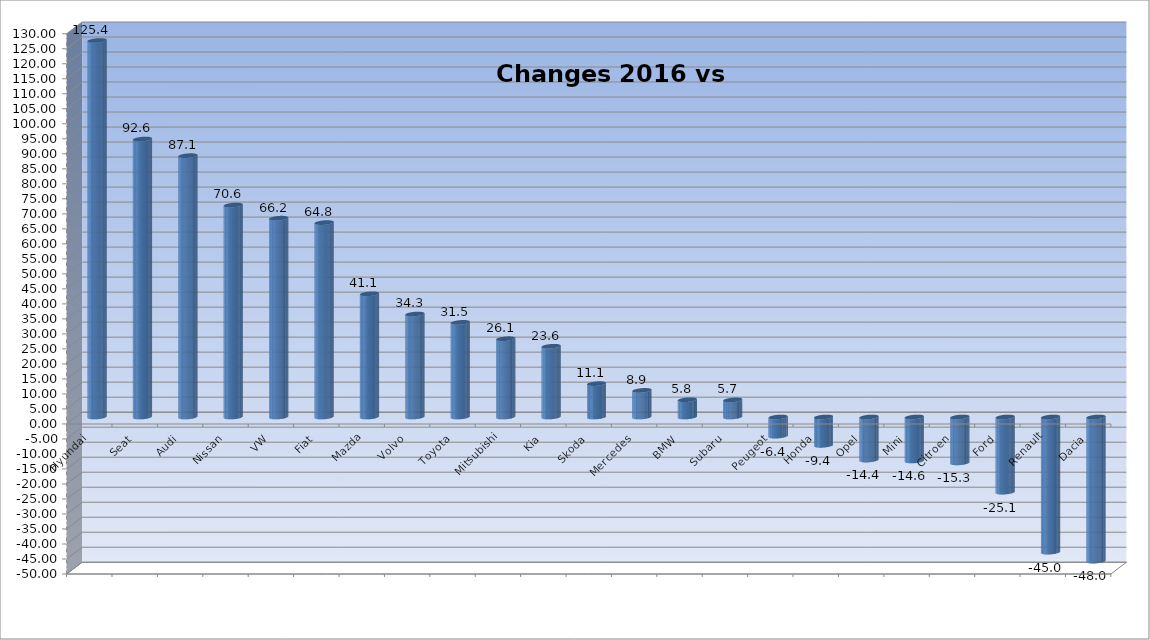
| Category | Ytd 2015 |
|---|---|
| Hyundai | 125.436 |
| Seat | 92.612 |
| Audi | 87.072 |
| Nissan | 70.614 |
| VW | 66.24 |
| Fiat | 64.773 |
| Mazda | 41.05 |
| Volvo | 34.303 |
| Toyota | 31.523 |
| Mitsubishi | 26.087 |
| Kia | 23.576 |
| Skoda | 11.111 |
| Mercedes | 8.863 |
| BMW | 5.751 |
| Subaru | 5.691 |
| Peugeot | -6.386 |
| Honda | -9.442 |
| Opel | -14.354 |
| Mini | -14.646 |
| Citroen | -15.289 |
| Ford | -25.053 |
| Renault | -45.034 |
| Dacia | -48.026 |